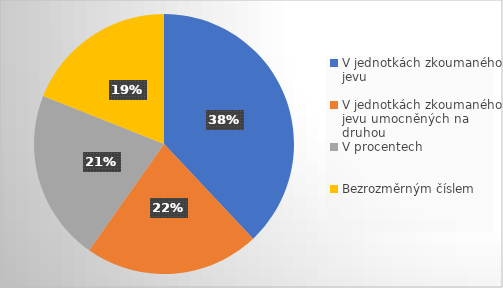
| Category | Series 0 |
|---|---|
| V jednotkách zkoumaného jevu | 68 |
| V jednotkách zkoumaného jevu umocněných na druhou | 39 |
| V procentech | 38 |
| Bezrozměrným číslem | 34 |